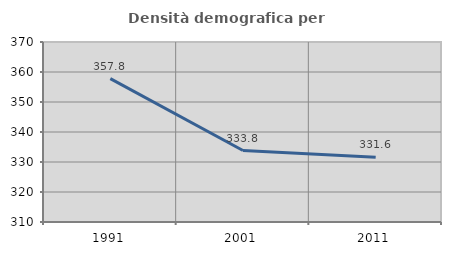
| Category | Densità demografica |
|---|---|
| 1991.0 | 357.79 |
| 2001.0 | 333.829 |
| 2011.0 | 331.577 |